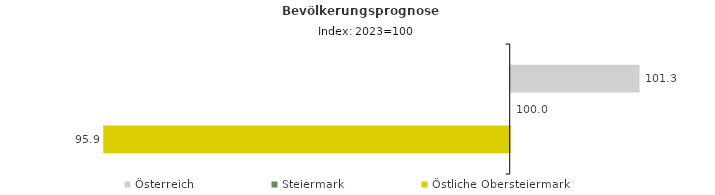
| Category | Österreich | Steiermark | Östliche Obersteiermark |
|---|---|---|---|
| 2023.0 | 101.3 | 100 | 95.9 |